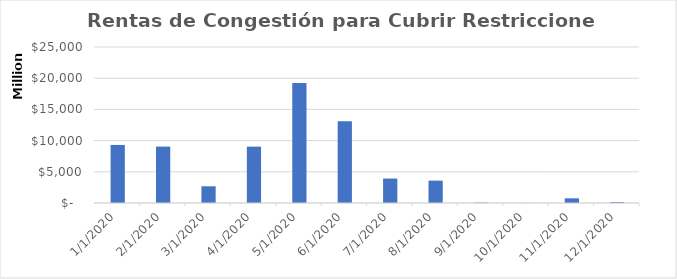
| Category | Rentas de Congestión para Cubrir Restricciones (COP) |
|---|---|
| 1/1/20 | 9304955063.99 |
| 2/1/20 | 9041886030.58 |
| 3/1/20 | 2678690523.54 |
| 4/1/20 | 9032021580.94 |
| 5/1/20 | 19242237062.98 |
| 6/1/20 | 13089459491.94 |
| 7/1/20 | 3921150687.43 |
| 8/1/20 | 3586388342.18 |
| 9/1/20 | 63017901.51 |
| 10/1/20 | 10749648.23 |
| 11/1/20 | 748963073.96 |
| 12/1/20 | 149784232.16 |